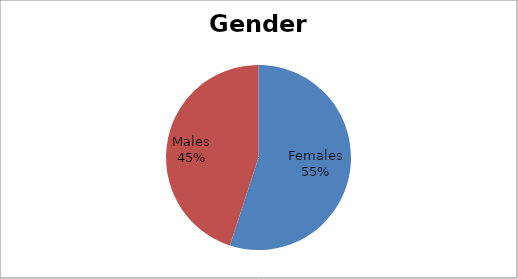
| Category | Gender |
|---|---|
| Females | 11 |
| Males | 9 |